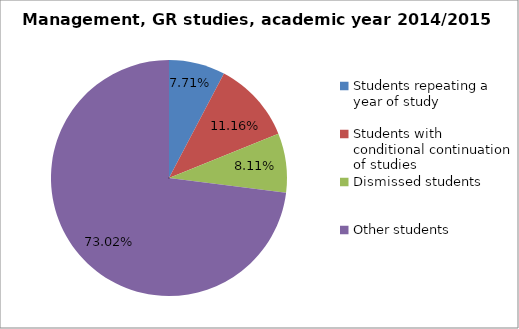
| Category | Series 0 |
|---|---|
| Students repeating a year of study | 38 |
| Students with conditional continuation of studies | 55 |
| Dismissed students | 40 |
| Other students | 360 |